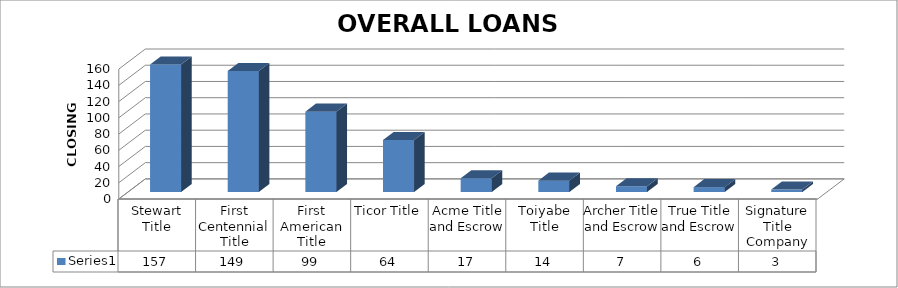
| Category | Series 0 |
|---|---|
| Stewart Title | 157 |
| First Centennial Title | 149 |
| First American Title | 99 |
| Ticor Title | 64 |
| Acme Title and Escrow | 17 |
| Toiyabe Title | 14 |
| Archer Title and Escrow | 7 |
| True Title and Escrow | 6 |
| Signature Title Company | 3 |